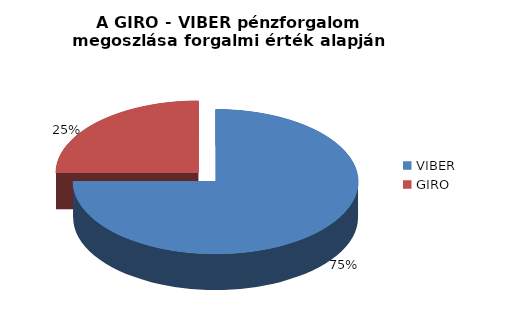
| Category | Forgalmi érték alapján 2016-ban |
|---|---|
| VIBER | 0.75 |
| GIRO | 0.25 |